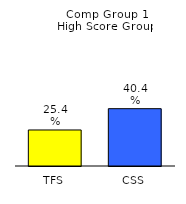
| Category | Series 0 |
|---|---|
| TFS | 0.254 |
| CSS | 0.404 |